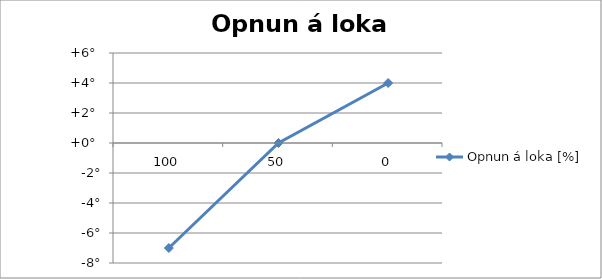
| Category | Opnun á loka [%] |
|---|---|
| 100.0 | -7 |
| 50.0 | 0 |
| 0.0 | 4 |